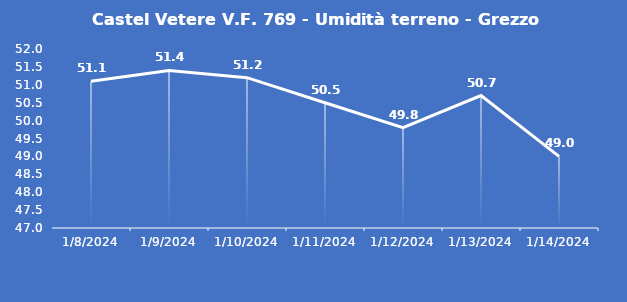
| Category | Castel Vetere V.F. 769 - Umidità terreno - Grezzo (%VWC) |
|---|---|
| 1/8/24 | 51.1 |
| 1/9/24 | 51.4 |
| 1/10/24 | 51.2 |
| 1/11/24 | 50.5 |
| 1/12/24 | 49.8 |
| 1/13/24 | 50.7 |
| 1/14/24 | 49 |